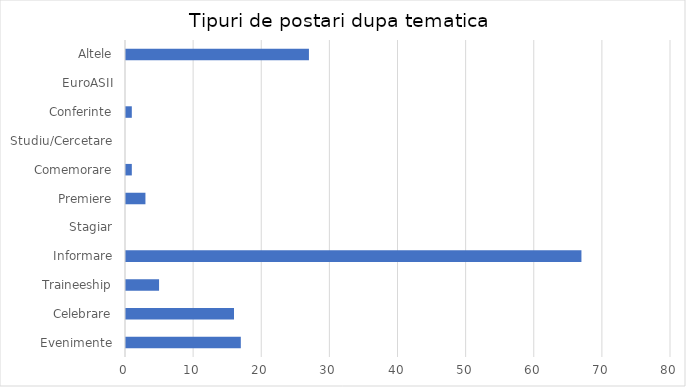
| Category | Series 0 |
|---|---|
| Evenimente | 17 |
| Celebrare | 16 |
| Traineeship | 5 |
| Informare | 67 |
| Stagiar | 0 |
| Premiere | 3 |
| Comemorare | 1 |
| Studiu/Cercetare | 0 |
| Conferinte | 1 |
| EuroASII | 0 |
| Altele | 27 |